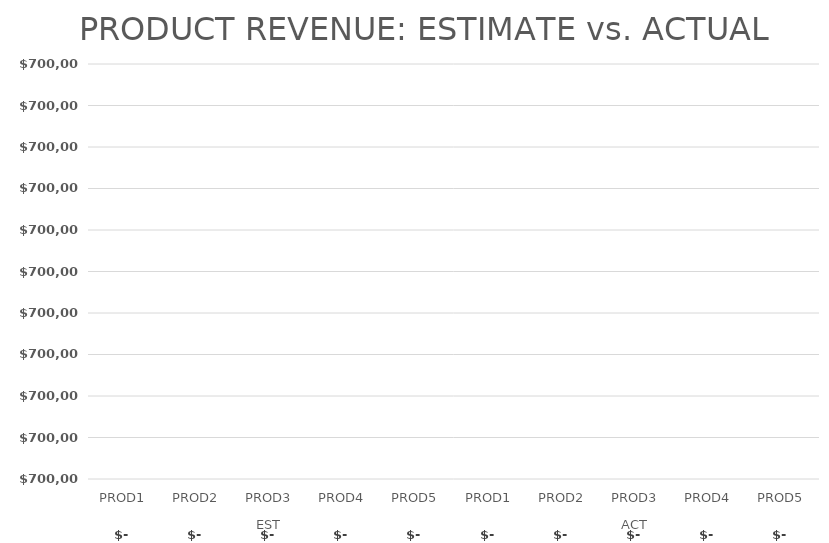
| Category | 2028 |
|---|---|
| 0 | 0 |
| 1 | 0 |
| 2 | 0 |
| 3 | 0 |
| 4 | 0 |
| 5 | 0 |
| 6 | 0 |
| 7 | 0 |
| 8 | 0 |
| 9 | 0 |